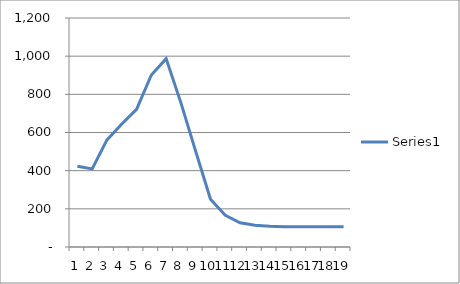
| Category | Series 0 |
|---|---|
| 0 | 422.739 |
| 1 | 409.454 |
| 2 | 561.265 |
| 3 | 644.544 |
| 4 | 721.447 |
| 5 | 901.261 |
| 6 | 987.124 |
| 7 | 755.156 |
| 8 | 501.116 |
| 9 | 250.558 |
| 10 | 166.269 |
| 11 | 127.197 |
| 12 | 114.477 |
| 13 | 108.753 |
| 14 | 106.578 |
| 15 | 105.512 |
| 16 | 105.512 |
| 17 | 105.512 |
| 18 | 105.512 |